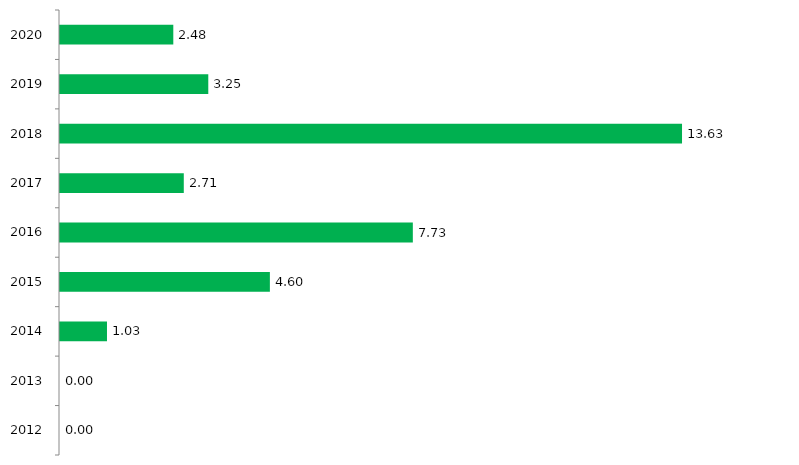
| Category | Series 1 |
|---|---|
| 2012.0 | 0 |
| 2013.0 | 0 |
| 2014.0 | 1.03 |
| 2015.0 | 4.6 |
| 2016.0 | 7.733 |
| 2017.0 | 2.713 |
| 2018.0 | 13.633 |
| 2019.0 | 3.25 |
| 2020.0 | 2.483 |